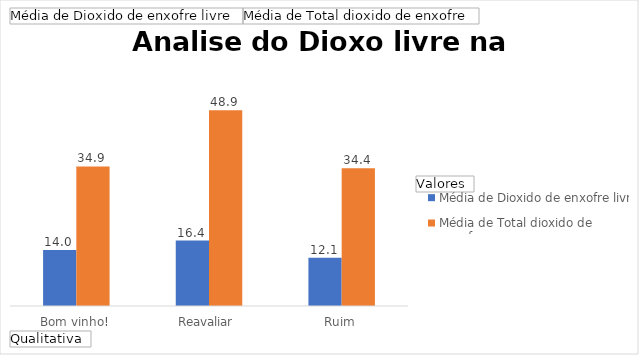
| Category | Média de Dioxido de enxofre livre | Média de Total dioxido de enxofre |
|---|---|---|
| Bom vinho! | 13.982 | 34.889 |
| Reavaliar | 16.368 | 48.947 |
| Ruim | 12.063 | 34.444 |